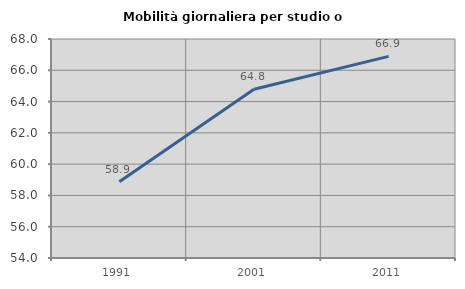
| Category | Mobilità giornaliera per studio o lavoro |
|---|---|
| 1991.0 | 58.87 |
| 2001.0 | 64.789 |
| 2011.0 | 66.888 |